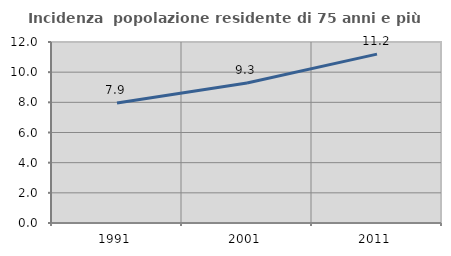
| Category | Incidenza  popolazione residente di 75 anni e più |
|---|---|
| 1991.0 | 7.95 |
| 2001.0 | 9.279 |
| 2011.0 | 11.196 |